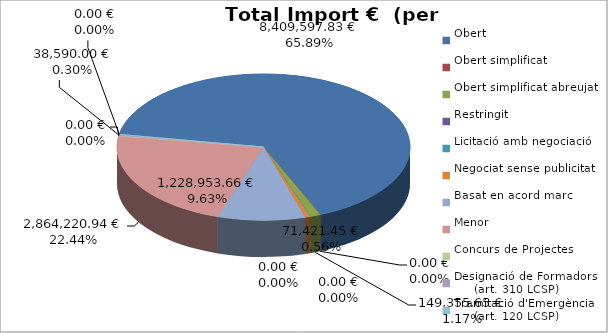
| Category | Total preu
(amb IVA) |
|---|---|
| Obert | 8409597.83 |
| Obert simplificat | 0 |
| Obert simplificat abreujat | 149355.65 |
| Restringit | 0 |
| Licitació amb negociació | 0 |
| Negociat sense publicitat | 71421.45 |
| Basat en acord marc | 1228953.66 |
| Menor | 2864220.94 |
| Concurs de Projectes | 0 |
| Designació de Formadors
     (art. 310 LCSP) | 38590 |
| Tramitació d'Emergència
     (art. 120 LCSP) | 0 |